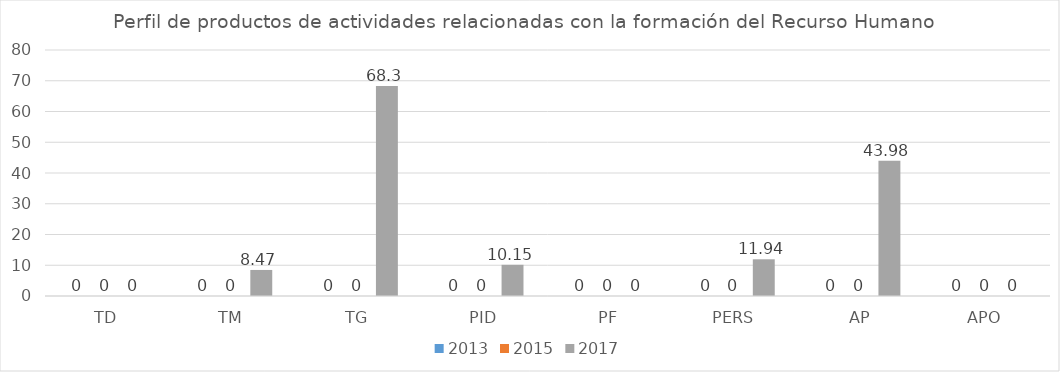
| Category | 2013 | 2015 | 2017 |
|---|---|---|---|
| TD | 0 | 0 | 0 |
| TM | 0 | 0 | 8.47 |
| TG | 0 | 0 | 68.3 |
| PID | 0 | 0 | 10.15 |
| PF | 0 | 0 | 0 |
| PERS | 0 | 0 | 11.94 |
| AP | 0 | 0 | 43.98 |
| APO | 0 | 0 | 0 |